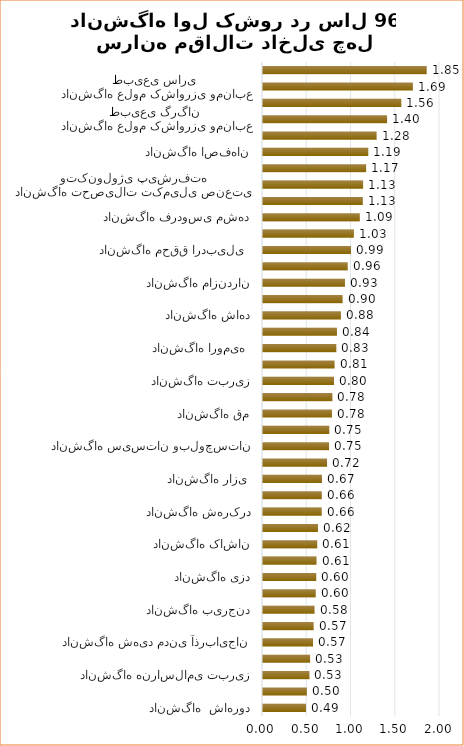
| Category | سرانه مقاله داخلی 96 |
|---|---|
| دانشگاه  شاهرود | 0.486 |
| دانشگاه کردستان | 0.495 |
| دانشگاه هنراسلامی تبریز | 0.525 |
| دانشگاه یاسوج | 0.532 |
| دانشگاه شهید مدنی آذربایجان | 0.565 |
| دانشگاه شهیدباهنرکرمان | 0.572 |
| دانشگاه بیرجند | 0.582 |
| دانشگاه بین المللی امام خمینی ( ره)  | 0.596 |
| دانشگاه یزد | 0.602 |
| دانشگاه زنجان | 0.605 |
| دانشگاه کاشان | 0.613 |
| دانشگاه علم وصنعت ایران | 0.621 |
| دانشگاه شهرکرد | 0.663 |
| دانشگاه گیلان | 0.664 |
| دانشگاه رازی  | 0.666 |
| دانشگاه شیراز | 0.724 |
| دانشگاه سیستان وبلوچستان | 0.746 |
| دانشگاه الزهرا | 0.749 |
| دانشگاه قم | 0.779 |
| دانشگاه شهیدچمران اهواز | 0.784 |
| دانشگاه تبریز | 0.802 |
| دانشگاه ایلام  | 0.809 |
| دانشگاه ارومیه  | 0.829 |
| دانشگاه لرستان | 0.836 |
| دانشگاه شاهد | 0.881 |
| دانشگاه سمنان | 0.9 |
| دانشگاه مازندران | 0.926 |
| دانشگاه بوعلی سینا | 0.958 |
| دانشگاه محقق اردبیلی  | 0.994 |
| دانشگاه هنراصفهان | 1.027 |
| دانشگاه فردوسی مشهد | 1.094 |
| دانشگاه شهیدبهشتی  | 1.128 |
| دانشگاه تحصیلات تکمیلی صنعتی وتکنولوژی پیشرفته | 1.131 |
| دانشگاه خوارزمی | 1.165 |
| دانشگاه اصفهان | 1.19 |
| دانشگاه تربیت مدرس | 1.284 |
| دانشگاه علوم کشاورزی ومنابع طبیعی گرگان  | 1.402 |
| دانشگاه علامه طباطبایی  | 1.563 |
| دانشگاه علوم کشاورزی ومنابع طبیعی ساری  | 1.694 |
| دانشگاه تهران (سایت مرکزی) | 1.85 |